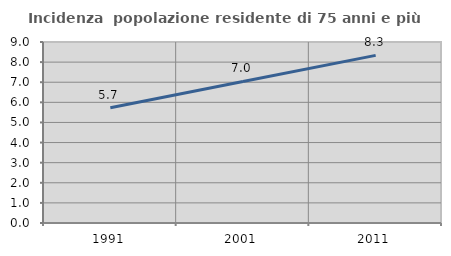
| Category | Incidenza  popolazione residente di 75 anni e più |
|---|---|
| 1991.0 | 5.734 |
| 2001.0 | 7.038 |
| 2011.0 | 8.334 |